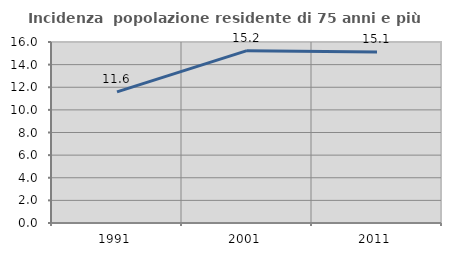
| Category | Incidenza  popolazione residente di 75 anni e più |
|---|---|
| 1991.0 | 11.588 |
| 2001.0 | 15.232 |
| 2011.0 | 15.113 |